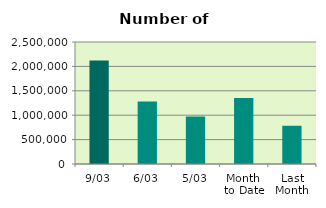
| Category | Series 0 |
|---|---|
| 9/03 | 2119622 |
| 6/03 | 1280340 |
| 5/03 | 974390 |
| Month 
to Date | 1351521.333 |
| Last
Month | 783511.9 |